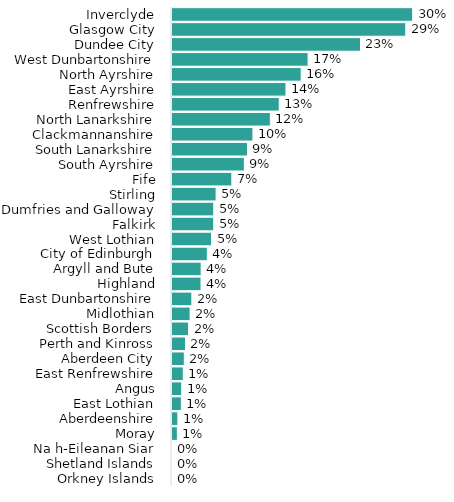
| Category | Percentage of population in decile 1 (most deprived) |
|---|---|
| Orkney Islands | 0 |
| Shetland Islands | 0 |
| Na h-Eileanan Siar | 0 |
| Moray | 0.007 |
| Aberdeenshire | 0.007 |
| East Lothian | 0.012 |
| Angus | 0.012 |
| East Renfrewshire | 0.014 |
| Aberdeen City | 0.015 |
| Perth and Kinross | 0.017 |
| Scottish Borders | 0.021 |
| Midlothian | 0.023 |
| East Dunbartonshire | 0.025 |
| Highland | 0.036 |
| Argyll and Bute | 0.036 |
| City of Edinburgh | 0.044 |
| West Lothian | 0.049 |
| Falkirk | 0.052 |
| Dumfries and Galloway | 0.052 |
| Stirling | 0.055 |
| Fife | 0.075 |
| South Ayrshire | 0.09 |
| South Lanarkshire | 0.094 |
| Clackmannanshire | 0.101 |
| North Lanarkshire | 0.122 |
| Renfrewshire | 0.134 |
| East Ayrshire | 0.142 |
| North Ayrshire | 0.161 |
| West Dunbartonshire | 0.17 |
| Dundee City | 0.235 |
| Glasgow City | 0.291 |
| Inverclyde | 0.3 |